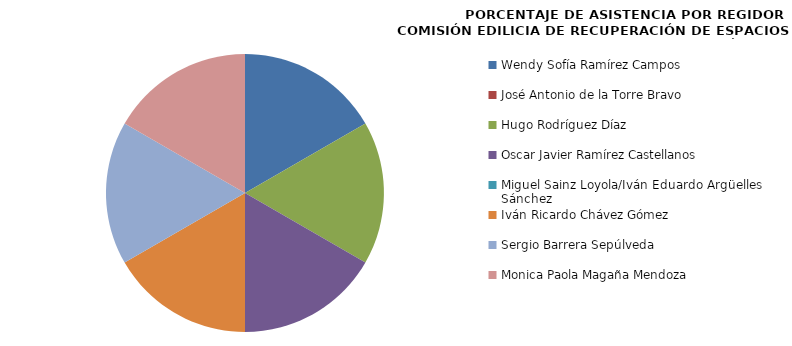
| Category | Series 0 |
|---|---|
| Wendy Sofía Ramírez Campos | 100 |
| José Antonio de la Torre Bravo | 0 |
| Hugo Rodríguez Díaz | 100 |
| Oscar Javier Ramírez Castellanos | 100 |
| Miguel Sainz Loyola/Iván Eduardo Argüelles Sánchez | 0 |
| Iván Ricardo Chávez Gómez | 100 |
| Sergio Barrera Sepúlveda | 100 |
| Monica Paola Magaña Mendoza | 100 |